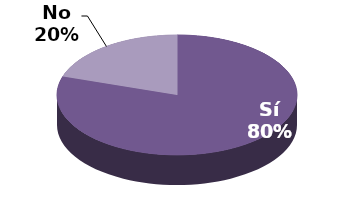
| Category | Series 1 |
|---|---|
| Sí | 8 |
| No | 2 |